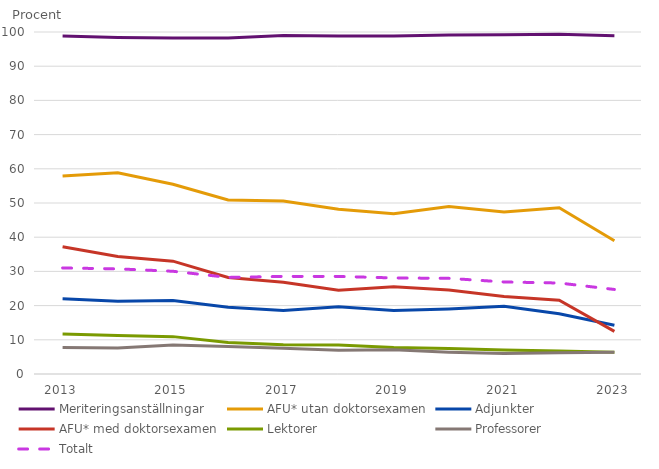
| Category | Meriteringsanställningar | AFU* utan doktorsexamen | Adjunkter | AFU* med doktorsexamen | Lektorer | Professorer | Totalt |
|---|---|---|---|---|---|---|---|
| 2013 | 98.805 | 57.874 | 21.972 | 37.226 | 11.681 | 7.769 | 31.003 |
| 2014 | 98.413 | 58.858 | 21.286 | 34.378 | 11.232 | 7.601 | 30.744 |
| 2015 | 98.225 | 55.468 | 21.483 | 32.998 | 10.928 | 8.476 | 30.036 |
| 2016 | 98.255 | 50.873 | 19.547 | 28.227 | 9.245 | 8.041 | 28.24 |
| 2017 | 98.953 | 50.58 | 18.554 | 26.834 | 8.576 | 7.528 | 28.537 |
| 2018 | 98.847 | 48.141 | 19.693 | 24.521 | 8.488 | 6.968 | 28.534 |
| 2019 | 98.816 | 46.832 | 18.56 | 25.516 | 7.734 | 7.093 | 28.089 |
| 2020 | 99.146 | 48.979 | 19.036 | 24.566 | 7.434 | 6.366 | 27.972 |
| 2021 | 99.176 | 47.358 | 19.802 | 22.636 | 7.048 | 5.969 | 26.914 |
| 2022 | 99.365 | 48.612 | 17.639 | 21.545 | 6.722 | 6.233 | 26.601 |
| 2023 | 98.922 | 38.971 | 14.267 | 12.455 | 6.347 | 6.377 | 24.721 |